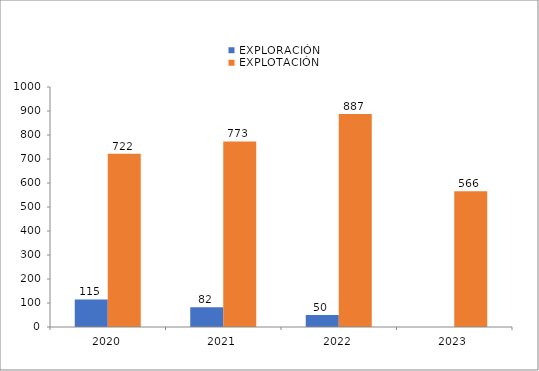
| Category | EXPLORACIÓN | EXPLOTACIÓN |
|---|---|---|
| 2020.0 | 115 | 722 |
| 2021.0 | 82 | 773 |
| 2022.0 | 50 | 887 |
| 2023.0 | 0 | 566 |